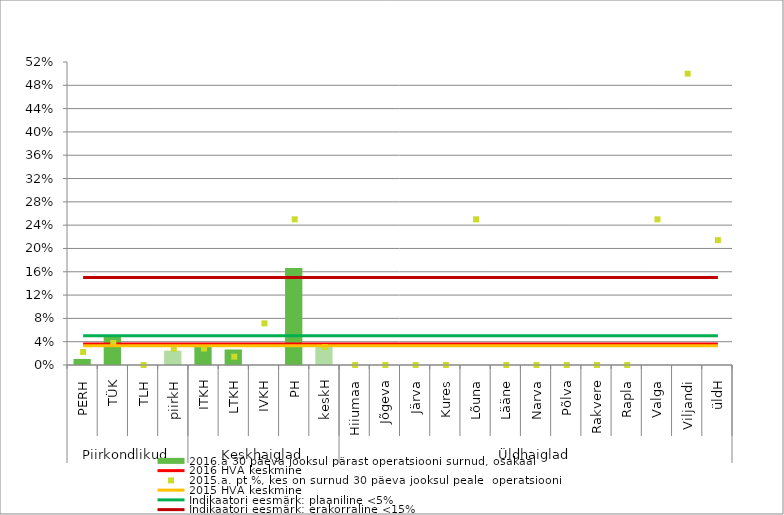
| Category | 2016.a 30 päeva jooksul pärast operatsiooni surnud, osakaal |
|---|---|
| 0 | 0.01 |
| 1 | 0.051 |
| 2 | 0 |
| 3 | 0.025 |
| 4 | 0.031 |
| 5 | 0.027 |
| 6 | 0 |
| 7 | 0.167 |
| 8 | 0.033 |
| 9 | 0 |
| 10 | 0 |
| 11 | 0 |
| 12 | 0 |
| 13 | 0 |
| 14 | 0 |
| 15 | 0 |
| 16 | 0 |
| 17 | 0 |
| 18 | 0 |
| 19 | 0 |
| 20 | 0 |
| 21 | 0 |